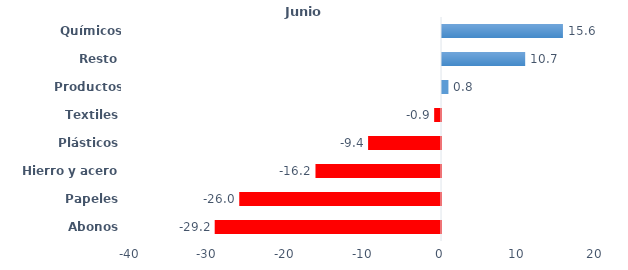
| Category | Series 0 |
|---|---|
| Abonos | -29.2 |
| Papeles | -26.031 |
| Hierro y acero | -16.195 |
| Plásticos | -9.407 |
| Textiles | -0.882 |
| Productos químicos | 0.829 |
| Resto | 10.733 |
| Químicos orgánicos | 15.604 |